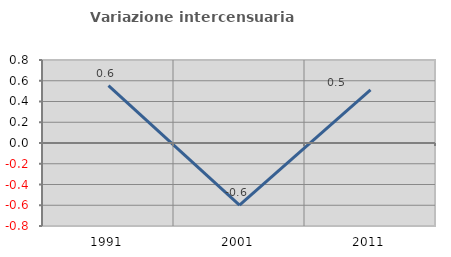
| Category | Variazione intercensuaria annua |
|---|---|
| 1991.0 | 0.553 |
| 2001.0 | -0.6 |
| 2011.0 | 0.512 |